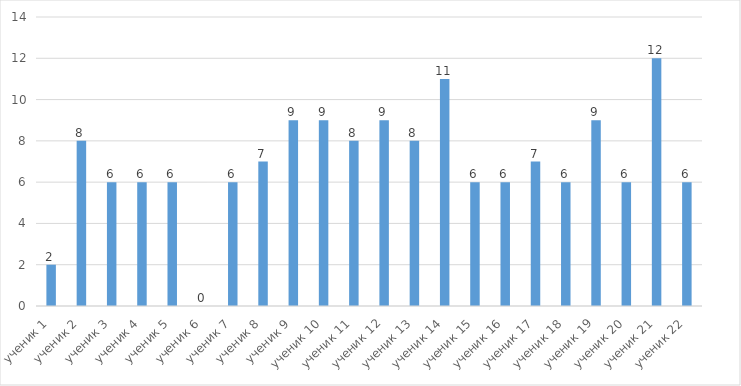
| Category | Series 0 |
|---|---|
| ученик 1 | 2 |
| ученик 2 | 8 |
| ученик 3 | 6 |
| ученик 4 | 6 |
| ученик 5 | 6 |
| ученик 6 | 0 |
| ученик 7 | 6 |
| ученик 8 | 7 |
| ученик 9 | 9 |
| ученик 10 | 9 |
| ученик 11 | 8 |
|  ученик 12 | 9 |
| ученик 13 | 8 |
| ученик 14 | 11 |
| ученик 15 | 6 |
| ученик 16 | 6 |
| ученик 17 | 7 |
| ученик 18 | 6 |
|  ученик 19 | 9 |
| ученик 20 | 6 |
| ученик 21 | 12 |
| ученик 22 | 6 |